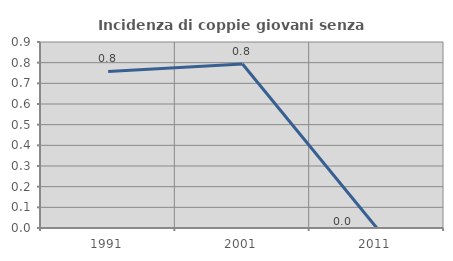
| Category | Incidenza di coppie giovani senza figli |
|---|---|
| 1991.0 | 0.758 |
| 2001.0 | 0.794 |
| 2011.0 | 0 |